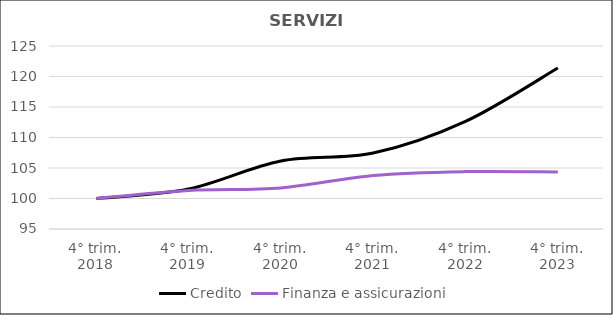
| Category | Credito | Finanza e assicurazioni  |
|---|---|---|
| 4° trim.
2018 | 100 | 100 |
| 4° trim.
2019 | 101.558 | 101.313 |
| 4° trim.
2020 | 106.147 | 101.733 |
| 4° trim.
2021 | 107.446 | 103.782 |
| 4° trim.
2022 | 112.641 | 104.412 |
| 4° trim.
2023 | 121.385 | 104.359 |